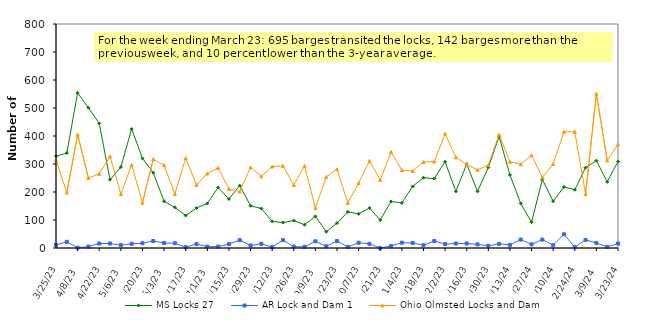
| Category | MS Locks 27 | AR Lock and Dam 1 | Ohio Olmsted Locks and Dam |
|---|---|---|---|
| 3/25/23 | 328 | 11 | 314 |
| 4/1/23 | 339 | 22 | 198 |
| 4/8/23 | 554 | 1 | 405 |
| 4/15/23 | 501 | 5 | 250 |
| 4/22/23 | 445 | 16 | 265 |
| 4/29/23 | 244 | 16 | 327 |
| 5/6/23 | 289 | 10 | 193 |
| 5/13/23 | 425 | 15 | 297 |
| 5/20/23 | 320 | 17 | 162 |
| 5/27/23 | 269 | 25 | 317 |
| 6/3/23 | 167 | 18 | 296 |
| 6/10/23 | 145 | 17 | 193 |
| 6/17/23 | 116 | 3 | 321 |
| 6/24/23 | 143 | 14 | 225 |
| 7/1/23 | 159 | 5 | 266 |
| 7/8/23 | 216 | 5 | 286 |
| 7/15/23 | 175 | 14 | 211 |
| 7/22/23 | 223 | 28 | 202 |
| 7/29/23 | 151 | 9 | 288 |
| 8/5/23 | 141 | 15 | 256 |
| 8/12/23 | 95 | 3 | 291 |
| 8/19/23 | 91 | 28 | 293 |
| 8/26/23 | 98 | 5 | 225 |
| 9/2/23 | 83 | 4 | 293 |
| 9/9/23 | 113 | 24 | 143 |
| 9/16/23 | 58 | 6 | 254 |
| 9/23/23 | 89 | 25 | 281 |
| 9/30/23 | 129 | 4 | 161 |
| 10/7/23 | 122 | 19 | 232 |
| 10/14/23 | 143 | 15 | 311 |
| 10/21/23 | 100 | 0 | 243 |
| 10/28/23 | 166 | 7 | 343 |
| 11/4/23 | 161 | 19 | 278 |
| 11/11/23 | 220 | 18 | 275 |
| 11/18/23 | 251 | 10 | 307 |
| 11/25/23 | 248 | 25 | 309 |
| 12/2/23 | 308 | 14 | 408 |
| 12/9/23 | 202 | 16 | 324 |
| 12/16/23 | 300 | 16 | 298 |
| 12/23/23 | 202 | 13 | 279 |
| 12/30/23 | 288 | 8 | 296 |
| 1/6/24 | 398 | 15 | 405 |
| 1/13/24 | 261 | 11 | 308 |
| 1/20/24 | 159 | 30 | 299 |
| 1/27/24 | 92 | 13 | 331 |
| 2/3/24 | 245 | 30 | 252 |
| 2/10/24 | 167 | 10 | 300 |
| 2/17/24 | 218 | 49 | 415 |
| 2/24/24 | 208 | 3 | 415 |
| 3/2/24 | 287 | 29 | 192 |
| 3/9/24 | 312 | 18 | 551 |
| 3/16/24 | 236 | 4 | 313 |
| 3/23/24 | 309 | 16 | 370 |